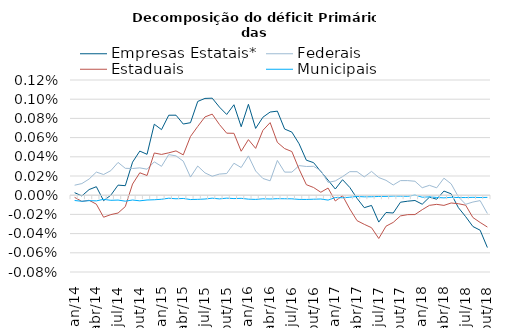
| Category | Empresas Estatais* | Federais | Estaduais | Municipais |
|---|---|---|---|---|
| jan/14 | 0 | 0 | 0 | 0 |
| fev/14 | 0 | 0 | 0 | 0 |
| mar/14 | 0 | 0 | 0 | 0 |
| abr/14 | 0 | 0 | 0 | 0 |
| mai/14 | 0 | 0 | 0 | 0 |
| jun/14 | 0 | 0 | 0 | 0 |
| jul/14 | 0 | 0 | 0 | 0 |
| ago/14 | 0 | 0 | 0 | 0 |
| set/14 | 0 | 0 | 0 | 0 |
| out/14 | 0 | 0 | 0 | 0 |
| nov/14 | 0 | 0 | 0 | 0 |
| dez/14 | 0.001 | 0 | 0 | 0 |
| jan/15 | 0.001 | 0 | 0 | 0 |
| fev/15 | 0.001 | 0 | 0 | 0 |
| mar/15 | 0.001 | 0 | 0 | 0 |
| abr/15 | 0.001 | 0 | 0 | 0 |
| mai/15 | 0.001 | 0 | 0.001 | 0 |
| jun/15 | 0.001 | 0 | 0.001 | 0 |
| jul/15 | 0.001 | 0 | 0.001 | 0 |
| ago/15 | 0.001 | 0 | 0.001 | 0 |
| set/15 | 0.001 | 0 | 0.001 | 0 |
| out/15 | 0.001 | 0 | 0.001 | 0 |
| nov/15 | 0.001 | 0 | 0.001 | 0 |
| dez/15 | 0.001 | 0 | 0 | 0 |
| jan/16 | 0.001 | 0 | 0.001 | 0 |
| fev/16 | 0.001 | 0 | 0 | 0 |
| mar/16 | 0.001 | 0 | 0.001 | 0 |
| abr/16 | 0.001 | 0 | 0.001 | 0 |
| mai/16 | 0.001 | 0 | 0.001 | 0 |
| jun/16 | 0.001 | 0 | 0 | 0 |
| jul/16 | 0.001 | 0 | 0 | 0 |
| ago/16 | 0.001 | 0 | 0 | 0 |
| set/16 | 0 | 0 | 0 | 0 |
| out/16 | 0 | 0 | 0 | 0 |
| nov/16 | 0 | 0 | 0 | 0 |
| dez/16 | 0 | 0 | 0 | 0 |
| jan/17 | 0 | 0 | 0 | 0 |
| fev/17 | 0 | 0 | 0 | 0 |
| mar/17 | 0 | 0 | 0 | 0 |
| abr/17 | 0 | 0 | 0 | 0 |
| mai/17 | 0 | 0 | 0 | 0 |
| jun/17 | 0 | 0 | 0 | 0 |
| jul/17 | 0 | 0 | 0 | 0 |
| ago/17 | 0 | 0 | 0 | 0 |
| set/17 | 0 | 0 | 0 | 0 |
| out/17 | 0 | 0 | 0 | 0 |
| nov/17 | 0 | 0 | 0 | 0 |
| dez/17 | 0 | 0 | 0 | 0 |
| jan/18 | 0 | 0 | 0 | 0 |
| fev/18 | 0 | 0 | 0 | 0 |
| mar/18 | 0 | 0 | 0 | 0 |
| abr/18 | 0 | 0 | 0 | 0 |
| mai/18 | 0 | 0 | 0 | 0 |
| jun/18 | 0 | 0 | 0 | 0 |
| jul/18 | 0 | 0 | 0 | 0 |
| ago/18 | 0 | 0 | 0 | 0 |
| set/18 | 0 | 0 | 0 | 0 |
| out/18 | -0.001 | 0 | 0 | 0 |